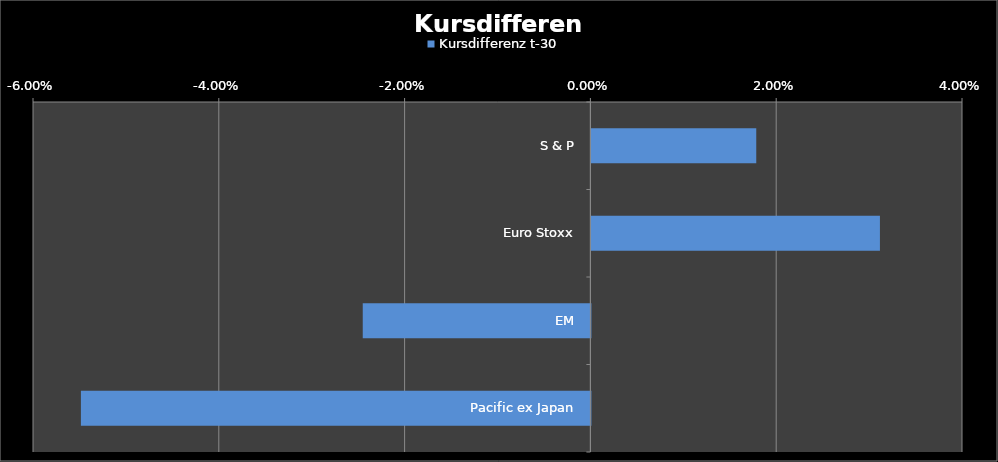
| Category | Kursdifferenz t-30 | #REF! | #BEZUG! |
|---|---|---|---|
| S & P | 0.018 |  |  |
| Euro Stoxx | 0.031 |  |  |
| EM | -0.025 |  |  |
| Pacific ex Japan | -0.055 |  |  |